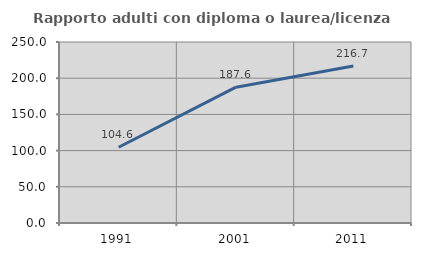
| Category | Rapporto adulti con diploma o laurea/licenza media  |
|---|---|
| 1991.0 | 104.61 |
| 2001.0 | 187.594 |
| 2011.0 | 216.725 |